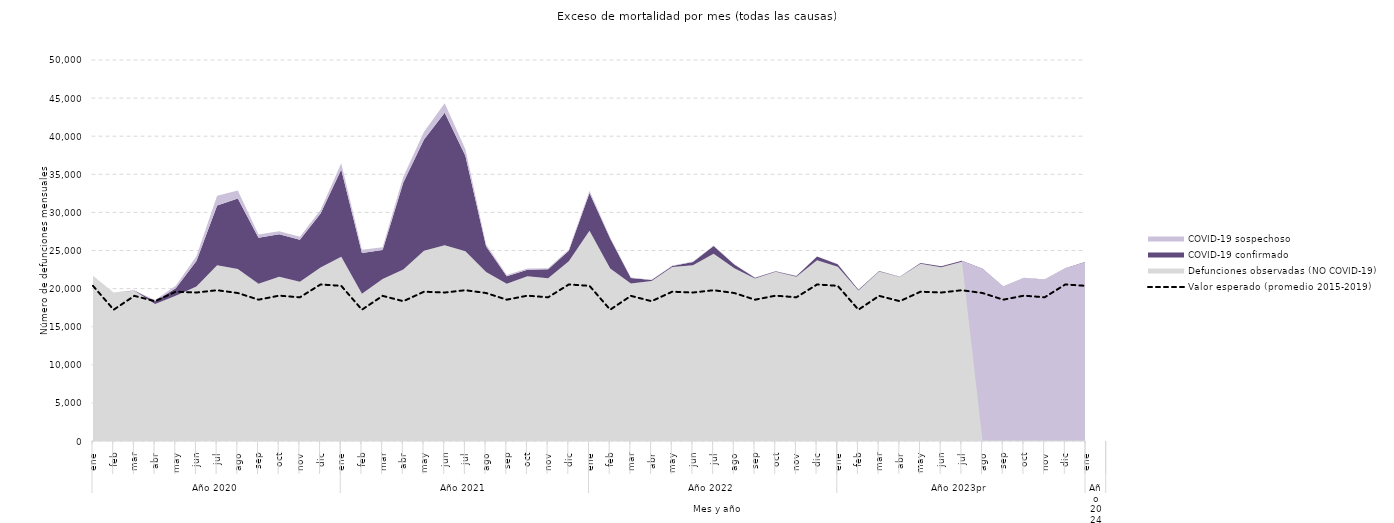
| Category | Valor esperado (promedio 2015-2019) |
|---|---|
| 0 | 20360.6 |
| 1 | 17229.2 |
| 2 | 19050 |
| 3 | 18346.2 |
| 4 | 19594.4 |
| 5 | 19486.2 |
| 6 | 19786.4 |
| 7 | 19420 |
| 8 | 18545.8 |
| 9 | 19074.4 |
| 10 | 18857 |
| 11 | 20542 |
| 12 | 20360.6 |
| 13 | 17229.2 |
| 14 | 19050 |
| 15 | 18346.2 |
| 16 | 19594.4 |
| 17 | 19486.2 |
| 18 | 19786.4 |
| 19 | 19420 |
| 20 | 18545.8 |
| 21 | 19074.4 |
| 22 | 18857 |
| 23 | 20542 |
| 24 | 20360.6 |
| 25 | 17229.2 |
| 26 | 19050 |
| 27 | 18346.2 |
| 28 | 19594.4 |
| 29 | 19486.2 |
| 30 | 19786.4 |
| 31 | 19420 |
| 32 | 18545.8 |
| 33 | 19074.4 |
| 34 | 18857 |
| 35 | 20542 |
| 36 | 20360.6 |
| 37 | 17229.2 |
| 38 | 19050 |
| 39 | 18346.2 |
| 40 | 19594.4 |
| 41 | 19486.2 |
| 42 | 19786.4 |
| 43 | 19420 |
| 44 | 18545.8 |
| 45 | 19074.4 |
| 46 | 18857 |
| 47 | 20542 |
| 48 | 20360.6 |